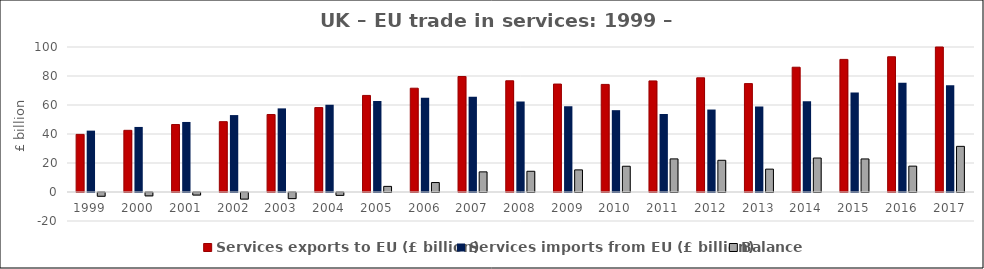
| Category | Services exports to EU (£ billion) | Services imports from EU (£ billion) | Balance |
|---|---|---|---|
| 1999.0 | 39.731 | 42.326 | -2.595 |
| 2000.0 | 42.542 | 44.867 | -2.324 |
| 2001.0 | 46.536 | 48.301 | -1.765 |
| 2002.0 | 48.508 | 53.051 | -4.543 |
| 2003.0 | 53.45 | 57.666 | -4.216 |
| 2004.0 | 58.214 | 60.187 | -1.973 |
| 2005.0 | 66.605 | 62.728 | 3.877 |
| 2006.0 | 71.579 | 65.053 | 6.526 |
| 2007.0 | 79.656 | 65.77 | 13.886 |
| 2008.0 | 76.702 | 62.408 | 14.293 |
| 2009.0 | 74.446 | 59.197 | 15.248 |
| 2010.0 | 74.198 | 56.431 | 17.767 |
| 2011.0 | 76.609 | 53.78 | 22.829 |
| 2012.0 | 78.743 | 56.876 | 21.867 |
| 2013.0 | 74.744 | 58.969 | 15.775 |
| 2014.0 | 86.052 | 62.619 | 23.433 |
| 2015.0 | 91.448 | 68.647 | 22.801 |
| 2016.0 | 93.263 | 75.428 | 17.835 |
| 2017.0 | 105.166 | 73.689 | 31.477 |